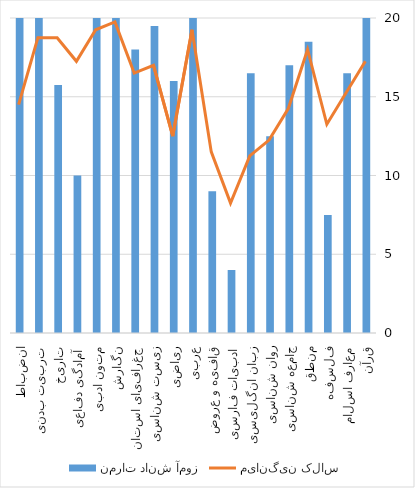
| Category | نمرات دانش آموز |
|---|---|
| قرآن | 20 |
| معارف اسلامی | 16.5 |
| فلسفه | 7.5 |
| منطق | 18.5 |
| جامعه شناسی | 17 |
| روان شناسی | 12.5 |
| زبان انگلیسی | 16.5 |
| ادبیات فارسی | 4 |
| قافیه و عروض | 9 |
| عربی | 20 |
| ریاضی | 16 |
| زیست شناسی | 19.5 |
| جغرافیای استان | 18 |
| نگارش | 20 |
| متون ادبی | 20 |
| آمادگی دفاعی | 10 |
| تاریخ | 15.75 |
| تربیت بدنی | 20 |
| انضباط | 20 |